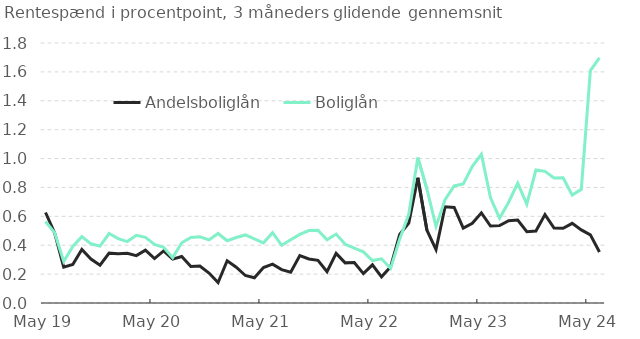
| Category | Andelsboliglån | Boliglån |
|---|---|---|
| 2019-05-01 | 0.627 | 0.564 |
| 2019-06-01 | 0.485 | 0.487 |
| 2019-07-01 | 0.248 | 0.288 |
| 2019-08-01 | 0.267 | 0.392 |
| 2019-09-01 | 0.371 | 0.46 |
| 2019-10-01 | 0.304 | 0.41 |
| 2019-11-01 | 0.261 | 0.394 |
| 2019-12-01 | 0.345 | 0.481 |
| 2020-01-01 | 0.342 | 0.446 |
| 2020-02-01 | 0.344 | 0.425 |
| 2020-03-01 | 0.328 | 0.469 |
| 2020-04-01 | 0.366 | 0.455 |
| 2020-05-01 | 0.308 | 0.405 |
| 2020-06-01 | 0.361 | 0.386 |
| 2020-07-01 | 0.304 | 0.314 |
| 2020-08-01 | 0.322 | 0.417 |
| 2020-09-01 | 0.253 | 0.454 |
| 2020-10-01 | 0.257 | 0.458 |
| 2020-11-01 | 0.208 | 0.437 |
| 2020-12-01 | 0.142 | 0.481 |
| 2021-01-01 | 0.293 | 0.431 |
| 2021-02-01 | 0.247 | 0.453 |
| 2021-03-01 | 0.19 | 0.471 |
| 2021-04-01 | 0.175 | 0.445 |
| 2021-05-01 | 0.245 | 0.417 |
| 2021-06-01 | 0.269 | 0.487 |
| 2021-07-01 | 0.231 | 0.399 |
| 2021-08-01 | 0.214 | 0.437 |
| 2021-09-01 | 0.328 | 0.475 |
| 2021-10-01 | 0.304 | 0.501 |
| 2021-11-01 | 0.296 | 0.504 |
| 2021-12-01 | 0.216 | 0.438 |
| 2022-01-01 | 0.343 | 0.477 |
| 2022-02-01 | 0.278 | 0.407 |
| 2022-03-01 | 0.28 | 0.381 |
| 2022-04-01 | 0.203 | 0.354 |
| 2022-05-01 | 0.264 | 0.294 |
| 2022-06-01 | 0.181 | 0.306 |
| 2022-07-01 | 0.25 | 0.239 |
| 2022-08-01 | 0.475 | 0.443 |
| 2022-09-01 | 0.554 | 0.614 |
| 2022-10-01 | 0.867 | 1.007 |
| 2022-11-01 | 0.504 | 0.789 |
| 2022-12-01 | 0.37 | 0.53 |
| 2023-01-01 | 0.666 | 0.716 |
| 2023-02-01 | 0.661 | 0.81 |
| 2023-03-01 | 0.519 | 0.825 |
| 2023-04-01 | 0.552 | 0.946 |
| 2023-05-01 | 0.624 | 1.03 |
| 2023-06-01 | 0.533 | 0.729 |
| 2023-07-01 | 0.536 | 0.588 |
| 2023-08-01 | 0.569 | 0.698 |
| 2023-09-01 | 0.574 | 0.83 |
| 2023-10-01 | 0.493 | 0.684 |
| 2023-11-01 | 0.499 | 0.921 |
| 2023-12-01 | 0.612 | 0.912 |
| 2024-01-01 | 0.519 | 0.866 |
| 2024-02-01 | 0.518 | 0.867 |
| 2024-03-01 | 0.552 | 0.747 |
| 2024-04-01 | 0.506 | 0.787 |
| 2024-05-01 | 0.472 | 1.609 |
| 2024-06-01 | 0.353 | 1.696 |